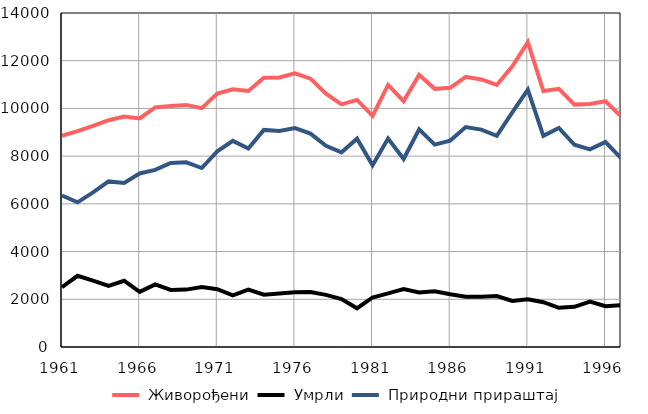
| Category |  Живорођени |  Умрли |  Природни прираштај |
|---|---|---|---|
| 1961.0 | 8856 | 2504 | 6352 |
| 1962.0 | 9046 | 2983 | 6063 |
| 1963.0 | 9265 | 2781 | 6484 |
| 1964.0 | 9505 | 2565 | 6940 |
| 1965.0 | 9656 | 2778 | 6878 |
| 1966.0 | 9583 | 2309 | 7274 |
| 1967.0 | 10046 | 2624 | 7422 |
| 1968.0 | 10104 | 2391 | 7713 |
| 1969.0 | 10148 | 2406 | 7742 |
| 1970.0 | 10014 | 2512 | 7502 |
| 1971.0 | 10620 | 2421 | 8199 |
| 1972.0 | 10804 | 2166 | 8638 |
| 1973.0 | 10730 | 2408 | 8322 |
| 1974.0 | 11291 | 2191 | 9100 |
| 1975.0 | 11299 | 2247 | 9052 |
| 1976.0 | 11468 | 2295 | 9173 |
| 1977.0 | 11248 | 2305 | 8943 |
| 1978.0 | 10617 | 2186 | 8431 |
| 1979.0 | 10170 | 2009 | 8161 |
| 1980.0 | 10358 | 1624 | 8734 |
| 1981.0 | 9690 | 2076 | 7614 |
| 1982.0 | 10986 | 2249 | 8737 |
| 1983.0 | 10306 | 2425 | 7881 |
| 1984.0 | 11410 | 2282 | 9128 |
| 1985.0 | 10821 | 2337 | 8484 |
| 1986.0 | 10865 | 2212 | 8653 |
| 1987.0 | 11323 | 2104 | 9219 |
| 1988.0 | 11215 | 2103 | 9112 |
| 1989.0 | 10983 | 2134 | 8849 |
| 1990.0 | 11767 | 1930 | 9837 |
| 1991.0 | 12782 | 1998 | 10784 |
| 1992.0 | 10730 | 1879 | 8851 |
| 1993.0 | 10821 | 1641 | 9180 |
| 1994.0 | 10161 | 1684 | 8477 |
| 1995.0 | 10190 | 1906 | 8284 |
| 1996.0 | 10303 | 1710 | 8593 |
| 1997.0 | 9666 | 1753 | 7913 |